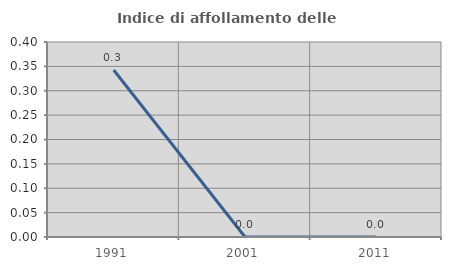
| Category | Indice di affollamento delle abitazioni  |
|---|---|
| 1991.0 | 0.342 |
| 2001.0 | 0 |
| 2011.0 | 0 |